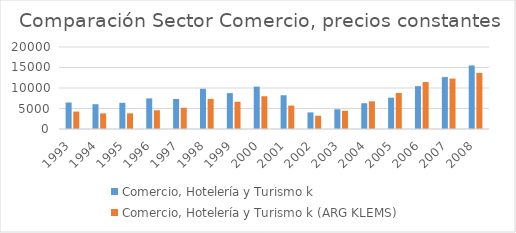
| Category | Comercio, Hotelería y Turismo k | Comercio, Hotelería y Turismo k (ARG KLEMS) |
|---|---|---|
| 1993.0 | 6466.874 | 4255.377 |
| 1994.0 | 6044.105 | 3800.772 |
| 1995.0 | 6386.796 | 3823.123 |
| 1996.0 | 7465.298 | 4567.054 |
| 1997.0 | 7311.608 | 5188.292 |
| 1998.0 | 9815.541 | 7347.468 |
| 1999.0 | 8748.577 | 6644.1 |
| 2000.0 | 10334.494 | 7992.573 |
| 2001.0 | 8233.7 | 5719.679 |
| 2002.0 | 4046.048 | 3232.425 |
| 2003.0 | 4809.756 | 4435.184 |
| 2004.0 | 6283.668 | 6756.757 |
| 2005.0 | 7640.124 | 8781.181 |
| 2006.0 | 10458.031 | 11454.765 |
| 2007.0 | 12664.417 | 12294.949 |
| 2008.0 | 15498.484 | 13681.412 |